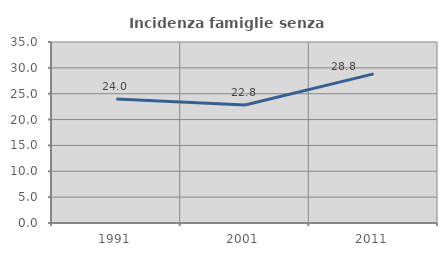
| Category | Incidenza famiglie senza nuclei |
|---|---|
| 1991.0 | 23.979 |
| 2001.0 | 22.828 |
| 2011.0 | 28.837 |